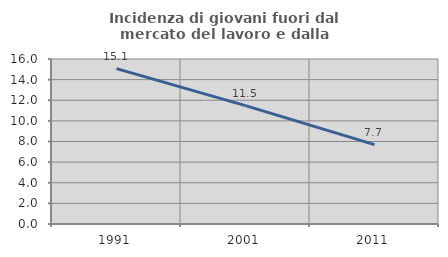
| Category | Incidenza di giovani fuori dal mercato del lavoro e dalla formazione  |
|---|---|
| 1991.0 | 15.068 |
| 2001.0 | 11.475 |
| 2011.0 | 7.692 |